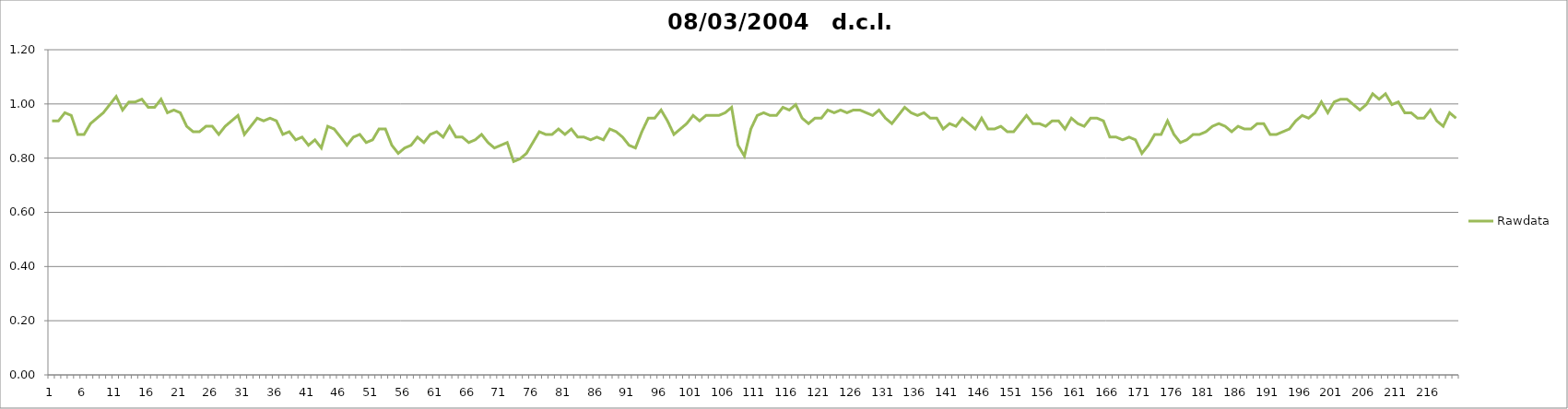
| Category | Rawdata |
|---|---|
| 0 | 0.938 |
| 1 | 0.938 |
| 2 | 0.968 |
| 3 | 0.958 |
| 4 | 0.888 |
| 5 | 0.888 |
| 6 | 0.928 |
| 7 | 0.948 |
| 8 | 0.968 |
| 9 | 0.998 |
| 10 | 1.028 |
| 11 | 0.978 |
| 12 | 1.008 |
| 13 | 1.008 |
| 14 | 1.018 |
| 15 | 0.988 |
| 16 | 0.988 |
| 17 | 1.018 |
| 18 | 0.968 |
| 19 | 0.978 |
| 20 | 0.968 |
| 21 | 0.918 |
| 22 | 0.898 |
| 23 | 0.898 |
| 24 | 0.918 |
| 25 | 0.918 |
| 26 | 0.888 |
| 27 | 0.918 |
| 28 | 0.938 |
| 29 | 0.958 |
| 30 | 0.888 |
| 31 | 0.918 |
| 32 | 0.948 |
| 33 | 0.938 |
| 34 | 0.948 |
| 35 | 0.938 |
| 36 | 0.888 |
| 37 | 0.898 |
| 38 | 0.867 |
| 39 | 0.878 |
| 40 | 0.847 |
| 41 | 0.867 |
| 42 | 0.837 |
| 43 | 0.918 |
| 44 | 0.908 |
| 45 | 0.878 |
| 46 | 0.847 |
| 47 | 0.878 |
| 48 | 0.888 |
| 49 | 0.857 |
| 50 | 0.867 |
| 51 | 0.908 |
| 52 | 0.908 |
| 53 | 0.847 |
| 54 | 0.818 |
| 55 | 0.838 |
| 56 | 0.847 |
| 57 | 0.878 |
| 58 | 0.857 |
| 59 | 0.888 |
| 60 | 0.898 |
| 61 | 0.878 |
| 62 | 0.918 |
| 63 | 0.878 |
| 64 | 0.878 |
| 65 | 0.857 |
| 66 | 0.867 |
| 67 | 0.888 |
| 68 | 0.858 |
| 69 | 0.838 |
| 70 | 0.848 |
| 71 | 0.858 |
| 72 | 0.788 |
| 73 | 0.798 |
| 74 | 0.818 |
| 75 | 0.858 |
| 76 | 0.898 |
| 77 | 0.888 |
| 78 | 0.888 |
| 79 | 0.908 |
| 80 | 0.888 |
| 81 | 0.908 |
| 82 | 0.878 |
| 83 | 0.878 |
| 84 | 0.868 |
| 85 | 0.878 |
| 86 | 0.867 |
| 87 | 0.908 |
| 88 | 0.898 |
| 89 | 0.878 |
| 90 | 0.847 |
| 91 | 0.837 |
| 92 | 0.898 |
| 93 | 0.948 |
| 94 | 0.948 |
| 95 | 0.978 |
| 96 | 0.938 |
| 97 | 0.888 |
| 98 | 0.908 |
| 99 | 0.928 |
| 100 | 0.958 |
| 101 | 0.938 |
| 102 | 0.958 |
| 103 | 0.958 |
| 104 | 0.958 |
| 105 | 0.968 |
| 106 | 0.988 |
| 107 | 0.848 |
| 108 | 0.808 |
| 109 | 0.908 |
| 110 | 0.958 |
| 111 | 0.968 |
| 112 | 0.958 |
| 113 | 0.958 |
| 114 | 0.988 |
| 115 | 0.978 |
| 116 | 0.998 |
| 117 | 0.948 |
| 118 | 0.928 |
| 119 | 0.948 |
| 120 | 0.948 |
| 121 | 0.978 |
| 122 | 0.968 |
| 123 | 0.978 |
| 124 | 0.968 |
| 125 | 0.978 |
| 126 | 0.978 |
| 127 | 0.968 |
| 128 | 0.958 |
| 129 | 0.978 |
| 130 | 0.948 |
| 131 | 0.928 |
| 132 | 0.958 |
| 133 | 0.988 |
| 134 | 0.968 |
| 135 | 0.958 |
| 136 | 0.968 |
| 137 | 0.948 |
| 138 | 0.948 |
| 139 | 0.908 |
| 140 | 0.928 |
| 141 | 0.918 |
| 142 | 0.948 |
| 143 | 0.928 |
| 144 | 0.908 |
| 145 | 0.948 |
| 146 | 0.908 |
| 147 | 0.908 |
| 148 | 0.918 |
| 149 | 0.898 |
| 150 | 0.898 |
| 151 | 0.928 |
| 152 | 0.958 |
| 153 | 0.928 |
| 154 | 0.928 |
| 155 | 0.918 |
| 156 | 0.938 |
| 157 | 0.938 |
| 158 | 0.908 |
| 159 | 0.948 |
| 160 | 0.928 |
| 161 | 0.918 |
| 162 | 0.948 |
| 163 | 0.948 |
| 164 | 0.938 |
| 165 | 0.878 |
| 166 | 0.878 |
| 167 | 0.868 |
| 168 | 0.878 |
| 169 | 0.868 |
| 170 | 0.818 |
| 171 | 0.848 |
| 172 | 0.888 |
| 173 | 0.888 |
| 174 | 0.938 |
| 175 | 0.888 |
| 176 | 0.858 |
| 177 | 0.867 |
| 178 | 0.888 |
| 179 | 0.888 |
| 180 | 0.898 |
| 181 | 0.918 |
| 182 | 0.928 |
| 183 | 0.918 |
| 184 | 0.898 |
| 185 | 0.918 |
| 186 | 0.908 |
| 187 | 0.908 |
| 188 | 0.928 |
| 189 | 0.928 |
| 190 | 0.888 |
| 191 | 0.888 |
| 192 | 0.898 |
| 193 | 0.908 |
| 194 | 0.938 |
| 195 | 0.958 |
| 196 | 0.948 |
| 197 | 0.968 |
| 198 | 1.008 |
| 199 | 0.968 |
| 200 | 1.008 |
| 201 | 1.018 |
| 202 | 1.018 |
| 203 | 0.998 |
| 204 | 0.978 |
| 205 | 0.998 |
| 206 | 1.038 |
| 207 | 1.018 |
| 208 | 1.038 |
| 209 | 0.998 |
| 210 | 1.008 |
| 211 | 0.968 |
| 212 | 0.968 |
| 213 | 0.948 |
| 214 | 0.948 |
| 215 | 0.978 |
| 216 | 0.938 |
| 217 | 0.918 |
| 218 | 0.968 |
| 219 | 0.948 |